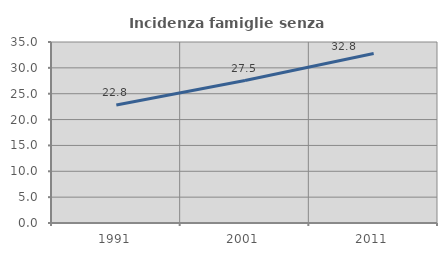
| Category | Incidenza famiglie senza nuclei |
|---|---|
| 1991.0 | 22.815 |
| 2001.0 | 27.543 |
| 2011.0 | 32.772 |